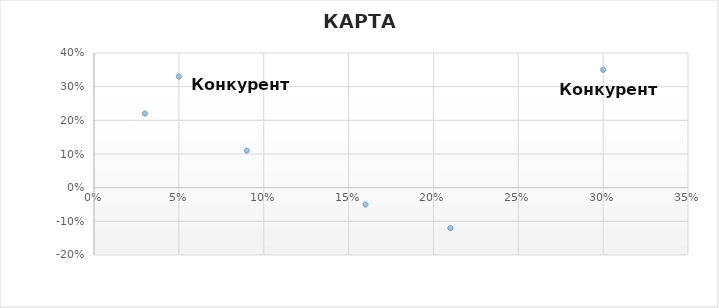
| Category | Темп роста |
|---|---|
| 0.3 | 0.35 |
| 0.05 | 0.33 |
| 0.21 | -0.12 |
| 0.03 | 0.22 |
| 0.16 | -0.05 |
| 0.09 | 0.11 |